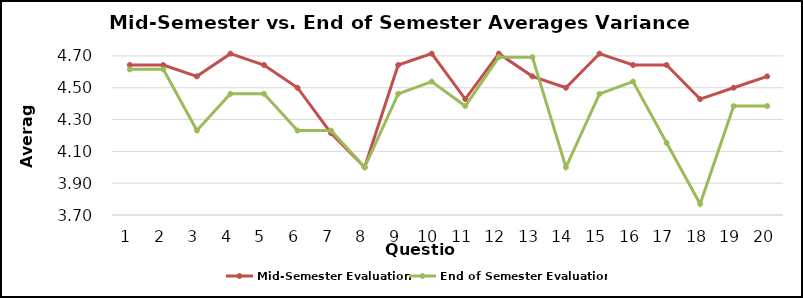
| Category | Mid-Semester Evaluation | End of Semester Evaluation |
|---|---|---|
| 0 | 4.643 | 4.615 |
| 1 | 4.643 | 4.615 |
| 2 | 4.571 | 4.231 |
| 3 | 4.714 | 4.462 |
| 4 | 4.643 | 4.462 |
| 5 | 4.5 | 4.231 |
| 6 | 4.214 | 4.231 |
| 7 | 4 | 4 |
| 8 | 4.643 | 4.462 |
| 9 | 4.714 | 4.538 |
| 10 | 4.429 | 4.385 |
| 11 | 4.714 | 4.692 |
| 12 | 4.571 | 4.692 |
| 13 | 4.5 | 4 |
| 14 | 4.714 | 4.462 |
| 15 | 4.643 | 4.538 |
| 16 | 4.643 | 4.154 |
| 17 | 4.429 | 3.769 |
| 18 | 4.5 | 4.385 |
| 19 | 4.571 | 4.385 |